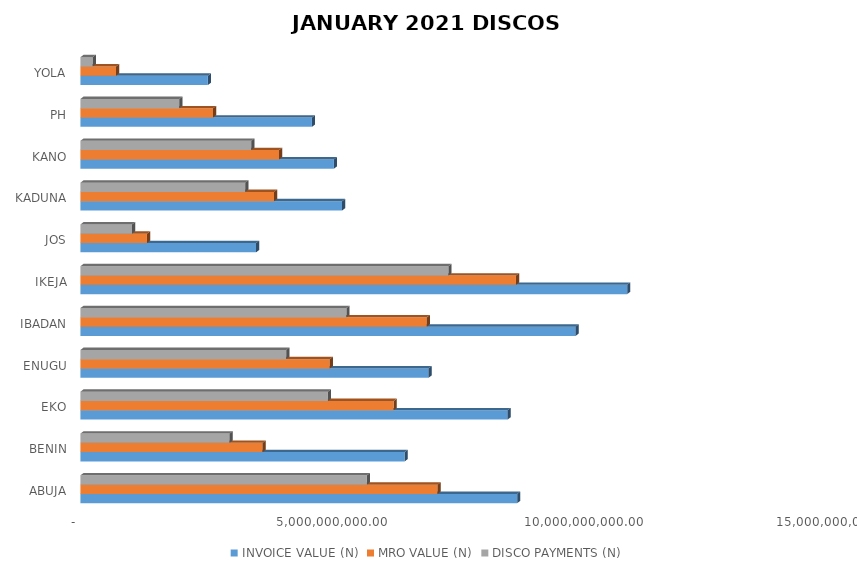
| Category | INVOICE VALUE (N) | MRO VALUE (N) | DISCO PAYMENTS (N) |
|---|---|---|---|
| ABUJA | 8664123924.08 | 7084654132.72 | 5683665294.53 |
| BENIN | 6432896237.22 | 3614644395.694 | 2959775558.75 |
| EKO | 8473766053.08 | 6213812646.724 | 4910547427.76 |
| ENUGU | 6906862973.02 | 4947385947.574 | 4082646703.35 |
| IBADAN | 9822549298.53 | 6871855489.252 | 5276673483.27 |
| IKEJA | 10846716157.2 | 8640494090.826 | 7300924645.41 |
| JOS | 3484777096.37 | 1320033564.105 | 1023479033.2 |
| KADUNA | 5191388028.4 | 3841627141.016 | 3271612735.5 |
| KANO | 5029144022.83 | 3941843085.094 | 3389643071.39 |
| PH | 4592993781.36 | 2630407538.585 | 1961667644.02 |
| YOLA | 2528762442.9 | 706283350.302 | 244140897.43 |